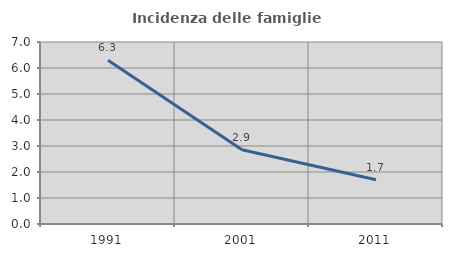
| Category | Incidenza delle famiglie numerose |
|---|---|
| 1991.0 | 6.296 |
| 2001.0 | 2.857 |
| 2011.0 | 1.703 |